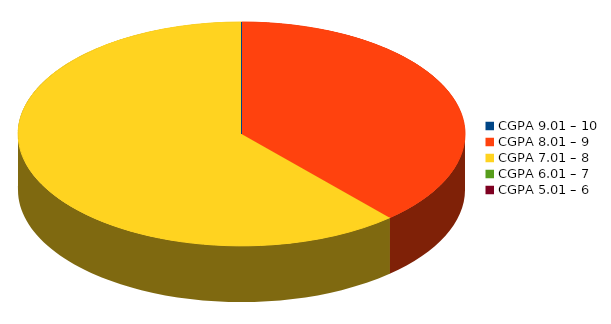
| Category | Number of students |
|---|---|
| CGPA 9.01 – 10 | 0 |
| CGPA 8.01 – 9 | 5 |
| CGPA 7.01 – 8 | 8 |
| CGPA 6.01 – 7 | 0 |
| CGPA 5.01 – 6 | 0 |